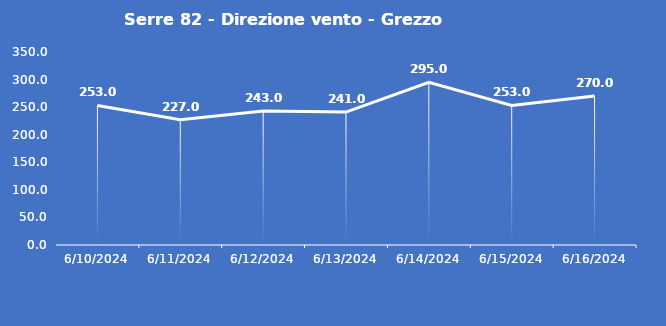
| Category | Serre 82 - Direzione vento - Grezzo (°N) |
|---|---|
| 6/10/24 | 253 |
| 6/11/24 | 227 |
| 6/12/24 | 243 |
| 6/13/24 | 241 |
| 6/14/24 | 295 |
| 6/15/24 | 253 |
| 6/16/24 | 270 |